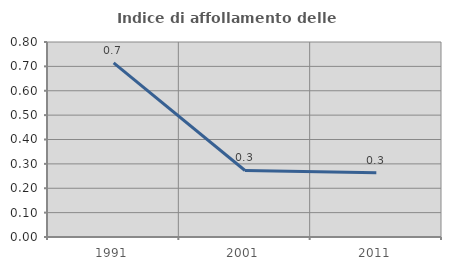
| Category | Indice di affollamento delle abitazioni  |
|---|---|
| 1991.0 | 0.714 |
| 2001.0 | 0.273 |
| 2011.0 | 0.264 |